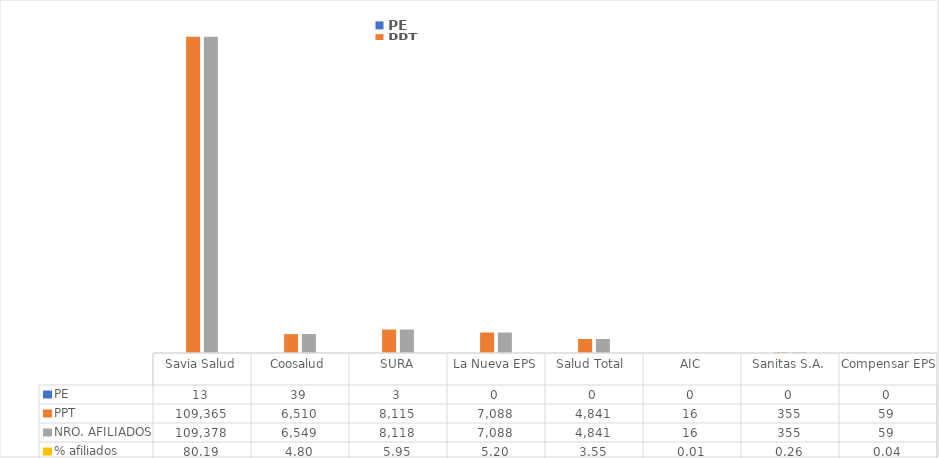
| Category | PE | PPT | NRO. AFILIADOS | % afiliados |
|---|---|---|---|---|
| Savia Salud | 13 | 109365 | 109378 | 80.187 |
| Coosalud | 39 | 6510 | 6549 | 4.801 |
| SURA | 3 | 8115 | 8118 | 5.951 |
| La Nueva EPS | 0 | 7088 | 7088 | 5.196 |
| Salud Total  | 0 | 4841 | 4841 | 3.549 |
| AIC | 0 | 16 | 16 | 0.012 |
| Sanitas S.A. | 0 | 355 | 355 | 0.26 |
| Compensar EPS | 0 | 59 | 59 | 0.043 |